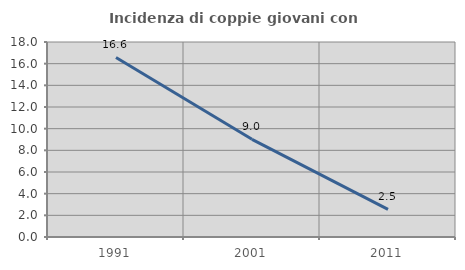
| Category | Incidenza di coppie giovani con figli |
|---|---|
| 1991.0 | 16.575 |
| 2001.0 | 9.019 |
| 2011.0 | 2.545 |